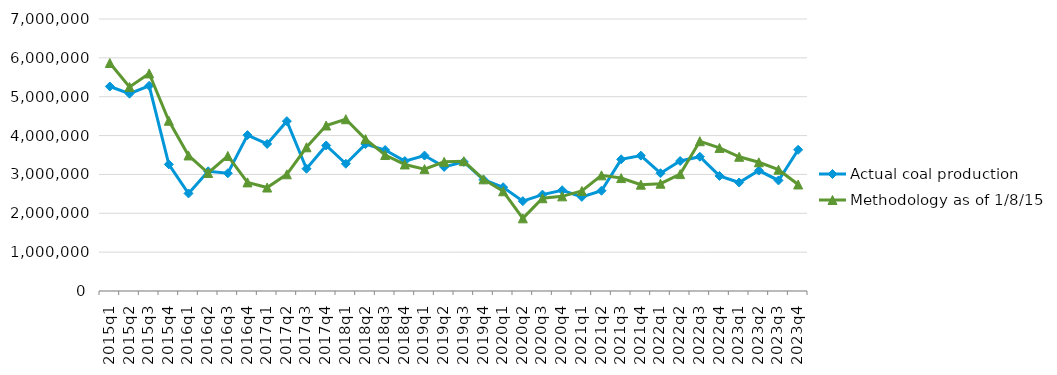
| Category | Actual coal production | Methodology as of 1/8/15 |
|---|---|---|
| 2015q1 | 5263448 | 5867991 |
| 2015q2 | 5077688 | 5252187 |
| 2015q3 | 5280107 | 5599280 |
| 2015q4 | 3257672 | 4381539 |
| 2016q1 | 2510018 | 3488358 |
| 2016q2 | 3081086 | 3036678 |
| 2016q3 | 3030765 | 3475314 |
| 2016q4 | 4012267 | 2795362 |
| 2017q1 | 3783929 | 2662602 |
| 2017q2 | 4370608 | 3003444 |
| 2017q3 | 3146854 | 3698495 |
| 2017q4 | 3745119 | 4259062 |
| 2018q1 | 3274795 | 4420501 |
| 2018q2 | 3779103 | 3909048 |
| 2018q3 | 3628148 | 3499229 |
| 2018q4 | 3343462 | 3256620 |
| 2019q1 | 3485922 | 3136847 |
| 2019q2 | 3193232 | 3323877 |
| 2019q3 | 3322904 | 3340785 |
| 2019q4 | 2866064 | 2873692 |
| 2020q1 | 2670938 | 2566346 |
| 2020q2 | 2313027 | 1870041 |
| 2020q3 | 2480262 | 2386833 |
| 2020q4 | 2592107 | 2435987 |
| 2021q1 | 2422215 | 2574203 |
| 2021q2 | 2580024 | 2976326 |
| 2021q3 | 3388419 | 2906008 |
| 2021q4 | 3484134 | 2736458 |
| 2022q1 | 3030824 | 2761108 |
| 2022q2 | 3345014 | 3008609 |
| 2022q3 | 3455718 | 3854883 |
| 2022q4 | 2961347 | 3681935 |
| 2023q1 | 2791663 | 3454194 |
| 2023q2 | 3099191 | 3312240 |
| 2023q3 | 2845033 | 3122171 |
| 2023q4 | 3635308 | 2741289 |